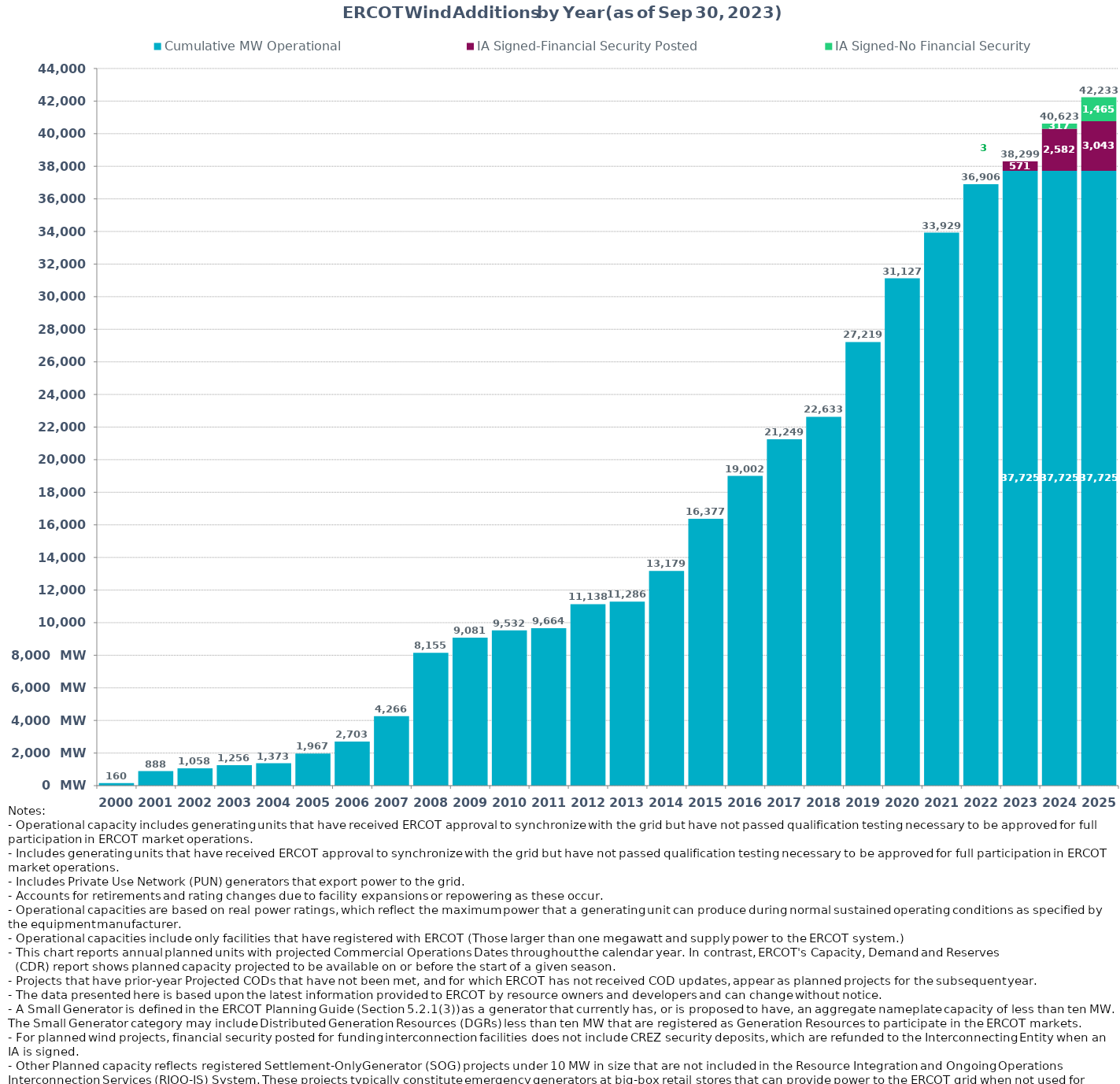
| Category | Cumulative MW Operational | IA Signed-Financial Security Posted  | IA Signed-No Financial Security  | Other Planned | Cumulative Installed and Planned |
|---|---|---|---|---|---|
| 2000.0 | 160.37 | 0 | 0 | 0 | 160.37 |
| 2001.0 | 887.97 | 0 | 0 | 0 | 887.97 |
| 2002.0 | 1058.22 | 0 | 0 | 0 | 1058.22 |
| 2003.0 | 1255.72 | 0 | 0 | 0 | 1255.72 |
| 2004.0 | 1372.82 | 0 | 0 | 0 | 1372.82 |
| 2005.0 | 1967.04 | 0 | 0 | 0 | 1967.04 |
| 2006.0 | 2703.34 | 0 | 0 | 0 | 2703.34 |
| 2007.0 | 4266.36 | 0 | 0 | 0 | 4266.36 |
| 2008.0 | 8154.76 | 0 | 0 | 0 | 8154.76 |
| 2009.0 | 9080.78 | 0 | 0 | 0 | 9080.78 |
| 2010.0 | 9531.7 | 0 | 0 | 0 | 9531.7 |
| 2011.0 | 9663.7 | 0 | 0 | 0 | 9663.7 |
| 2012.0 | 11137.66 | 0 | 0 | 0 | 11137.66 |
| 2013.0 | 11286.26 | 0 | 0 | 0 | 11286.26 |
| 2014.0 | 13178.84 | 0 | 0 | 0 | 13178.84 |
| 2015.0 | 16376.53 | 0 | 0 | 0 | 16376.53 |
| 2016.0 | 19001.85 | 0 | 0 | 0 | 19001.85 |
| 2017.0 | 21248.99 | 0 | 0 | 0 | 21248.99 |
| 2018.0 | 22632.69 | 0 | 0 | 0 | 22632.69 |
| 2019.0 | 27219.34 | 0 | 0 | 0 | 27219.34 |
| 2020.0 | 31127.31 | 0 | 0 | 0 | 31127.31 |
| 2021.0 | 33928.91 | 0 | 0 | 0 | 33928.91 |
| 2022.0 | 36906.07 | 0 | 0 | 0 | 36906.07 |
| 2023.0 | 37724.73 | 570.92 | 3 | 0 | 38298.65 |
| 2024.0 | 37724.73 | 2581.54 | 316.75 | 0 | 40623.02 |
| 2025.0 | 37724.73 | 3043.3 | 1465.24 | 0 | 42233.27 |